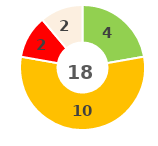
| Category | Series 0 |
|---|---|
| 0 | 0 |
| 1 | 4 |
| 2 | 10 |
| 3 | 2 |
| 4 | 2 |